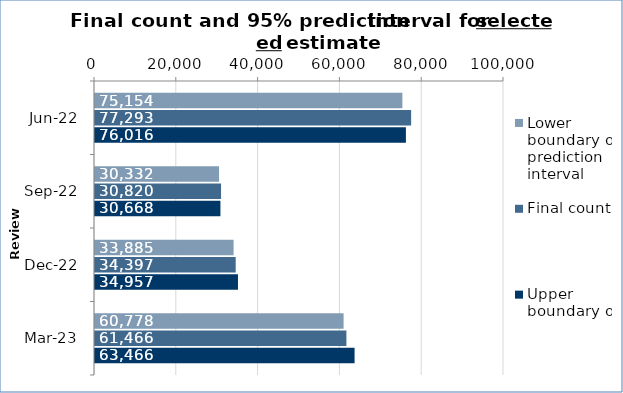
| Category | Lower boundary of prediction interval | Final count | Upper boundary of prediction interval |
|---|---|---|---|
| 2022-06-01 | 75154 | 77293 | 76016 |
| 2022-09-01 | 30332 | 30820 | 30668 |
| 2022-12-01 | 33885 | 34397 | 34957 |
| 2023-03-01 | 60778 | 61466 | 63466 |